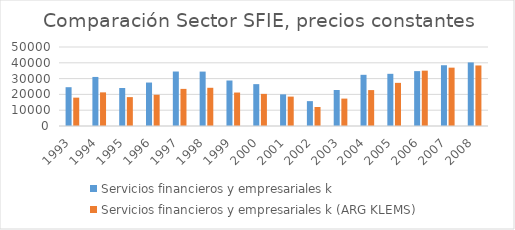
| Category | Servicios financieros y empresariales k | Servicios financieros y empresariales k (ARG KLEMS) |
|---|---|---|
| 1993.0 | 24555.963 | 17947.115 |
| 1994.0 | 31052.104 | 21289.769 |
| 1995.0 | 24055.489 | 18278.208 |
| 1996.0 | 27507.089 | 19763.09 |
| 1997.0 | 34481.504 | 23487.815 |
| 1998.0 | 34436.085 | 24185.462 |
| 1999.0 | 28791.555 | 21177.074 |
| 2000.0 | 26494.107 | 20325.359 |
| 2001.0 | 20019.829 | 18605.582 |
| 2002.0 | 15739.302 | 12022.225 |
| 2003.0 | 22779.12 | 17342.522 |
| 2004.0 | 32396.631 | 22730.096 |
| 2005.0 | 33026.177 | 27305.651 |
| 2006.0 | 34735.266 | 35030.348 |
| 2007.0 | 38461.73 | 36927.282 |
| 2008.0 | 40236.45 | 38312.996 |